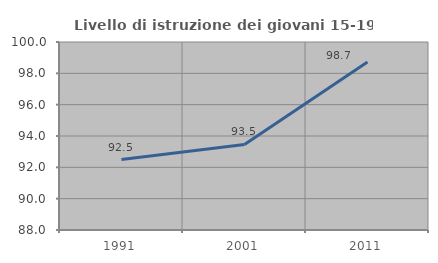
| Category | Livello di istruzione dei giovani 15-19 anni |
|---|---|
| 1991.0 | 92.5 |
| 2001.0 | 93.464 |
| 2011.0 | 98.718 |